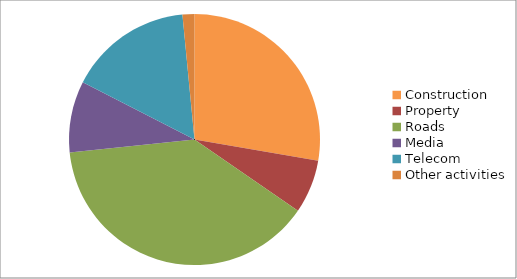
| Category | Sales |
|---|---|
| Construction | 8340 |
| Property | 2075 |
| Roads | 11673 |
| Media | 2764 |
| Telecom | 4796 |
| Other activities | 462 |